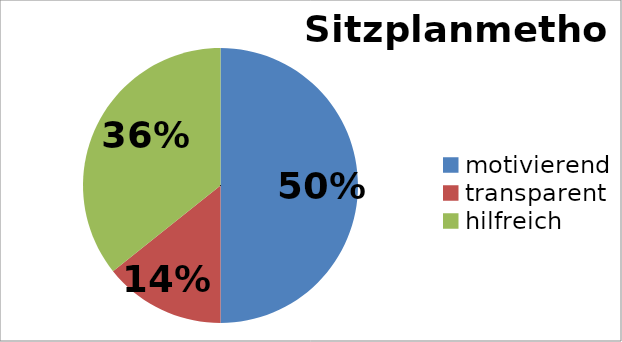
| Category | Sitzplanmethode |
|---|---|
| motivierend | 7 |
| transparent | 2 |
| hilfreich | 5 |